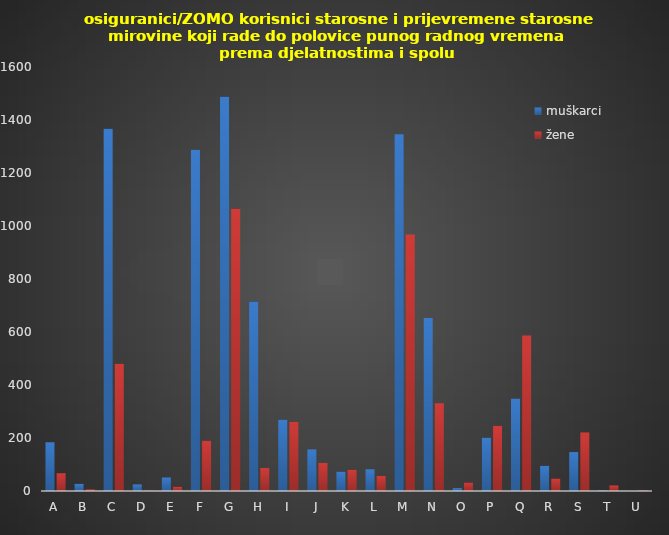
| Category | muškarci | žene |
|---|---|---|
| A | 184 | 67 |
| B | 27 | 6 |
| C | 1367 | 480 |
| D | 25 | 1 |
| E | 51 | 16 |
| F | 1288 | 190 |
| G | 1488 | 1066 |
| H | 715 | 87 |
| I | 269 | 261 |
| J | 157 | 106 |
| K | 73 | 80 |
| L | 82 | 57 |
| M | 1346 | 968 |
| N | 653 | 331 |
| O | 11 | 32 |
| P | 201 | 246 |
| Q | 349 | 587 |
| R | 95 | 47 |
| S | 147 | 221 |
| T | 2 | 21 |
| U | 0 | 2 |